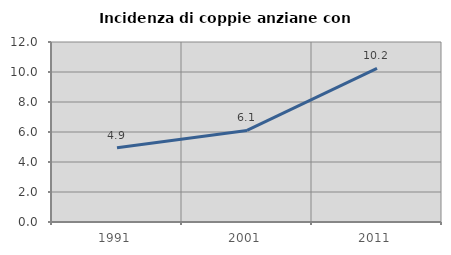
| Category | Incidenza di coppie anziane con figli |
|---|---|
| 1991.0 | 4.946 |
| 2001.0 | 6.103 |
| 2011.0 | 10.243 |